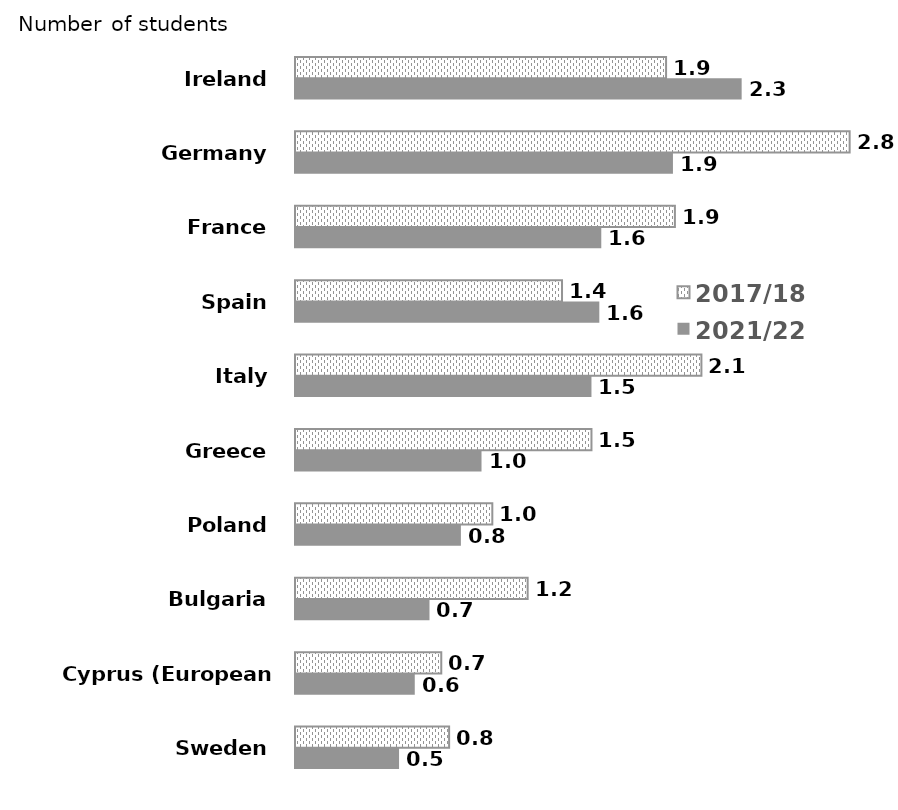
| Category | 2017/18 | 2021/22 |
|---|---|---|
| Ireland | 1890 | 2275 |
| Germany | 2825 | 1925 |
| France | 1935 | 1560 |
| Spain | 1360 | 1550 |
| Italy | 2070 | 1510 |
| Greece | 1510 | 950 |
| Poland | 1005 | 845 |
| Bulgaria | 1185 | 685 |
| Cyprus (European Union) | 745 | 610 |
| Sweden | 785 | 530 |